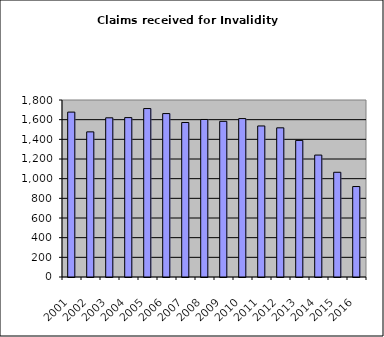
| Category | Series 1 |
|---|---|
| 2001.0 | 1677 |
| 2002.0 | 1476 |
| 2003.0 | 1619 |
| 2004.0 | 1621 |
| 2005.0 | 1713 |
| 2006.0 | 1662 |
| 2007.0 | 1571 |
| 2008.0 | 1602 |
| 2009.0 | 1583 |
| 2010.0 | 1611 |
| 2011.0 | 1536 |
| 2012.0 | 1517 |
| 2013.0 | 1389 |
| 2014.0 | 1240 |
| 2015.0 | 1065 |
| 2016.0 | 920 |